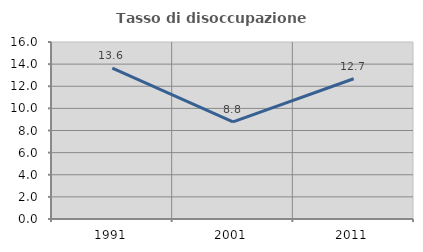
| Category | Tasso di disoccupazione giovanile  |
|---|---|
| 1991.0 | 13.636 |
| 2001.0 | 8.772 |
| 2011.0 | 12.676 |